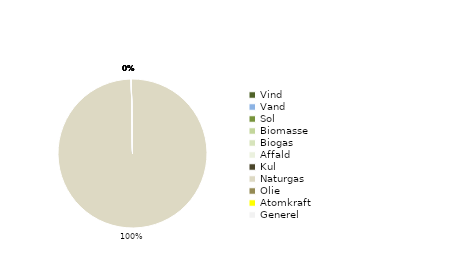
| Category | Series 0 | Series 1 |
|---|---|---|
| Vind | 0 |  |
| Vand | 0 |  |
| Sol | 0 |  |
| Biomasse | 0 |  |
| Biogas | 0 |  |
| Affald | 0 |  |
| Kul | 0 |  |
| Naturgas | 1 |  |
| Olie | 0 |  |
| Atomkraft | 0 |  |
| Generel | 0 |  |